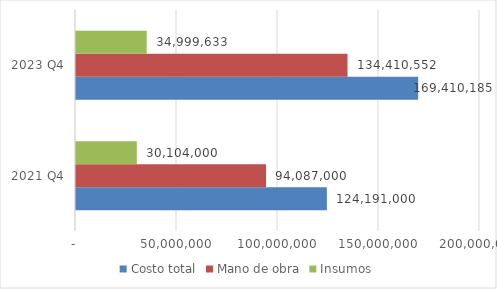
| Category | Costo total | Mano de obra | Insumos |
|---|---|---|---|
| 2021 Q4 | 124191000 | 94087000 | 30104000 |
| 2023 Q4 | 169410185.014 | 134410552 | 34999633.014 |